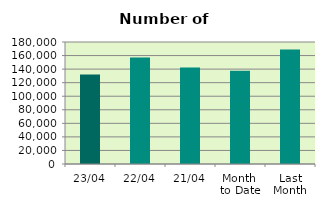
| Category | Series 0 |
|---|---|
| 23/04 | 132016 |
| 22/04 | 157008 |
| 21/04 | 142550 |
| Month 
to Date | 137733.733 |
| Last
Month | 168827.304 |